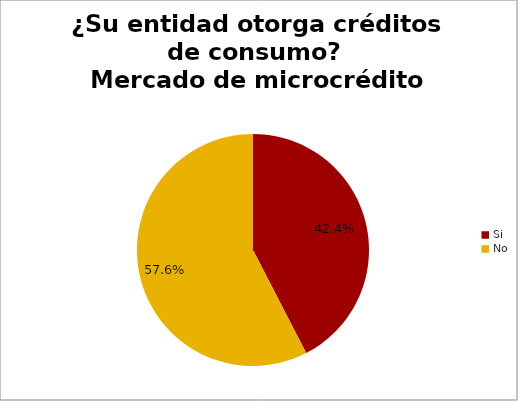
| Category | ¿Su entidad otorga créditos de consumo? Mercado de microcrédito |
|---|---|
| Si | 0.424 |
| No | 0.576 |